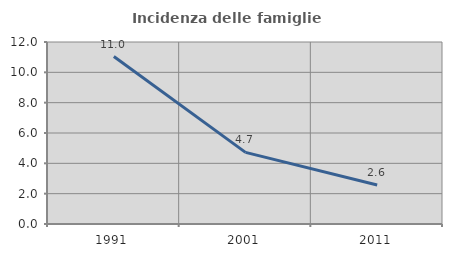
| Category | Incidenza delle famiglie numerose |
|---|---|
| 1991.0 | 11.043 |
| 2001.0 | 4.724 |
| 2011.0 | 2.569 |